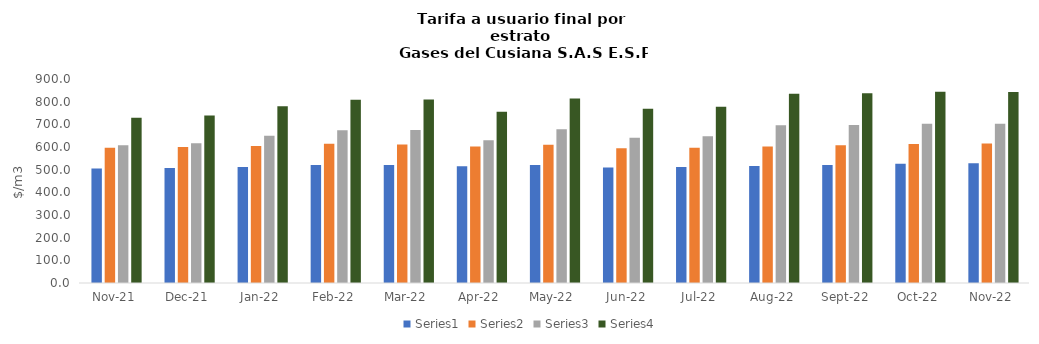
| Category | Series 0 | Series 1 | Series 2 | Series 3 |
|---|---|---|---|---|
| 2021-11-01 | 505.22 | 596.82 | 607.6 | 729.12 |
| 2021-12-01 | 507.79 | 599.85 | 616.19 | 739.428 |
| 2022-01-01 | 511.59 | 604.34 | 649.72 | 779.664 |
| 2022-02-01 | 520.48 | 614.84 | 674.14 | 808.968 |
| 2022-03-01 | 520.77 | 611.26 | 674.47 | 809.364 |
| 2022-04-01 | 514.86 | 602.49 | 629.43 | 755.316 |
| 2022-05-01 | 520.65 | 609.98 | 678.32 | 813.984 |
| 2022-06-01 | 509.1 | 593.97 | 640.64 | 768.768 |
| 2022-07-01 | 511.66 | 596.96 | 647.86 | 777.432 |
| 2022-08-01 | 515.81 | 601.8 | 695.58 | 834.696 |
| 2022-09-01 | 521.11 | 607.98 | 697.25 | 836.7 |
| 2022-10-01 | 525.98 | 613.66 | 702.69 | 843.228 |
| 2022-11-01 | 527.9 | 615.9 | 702.35 | 842.82 |